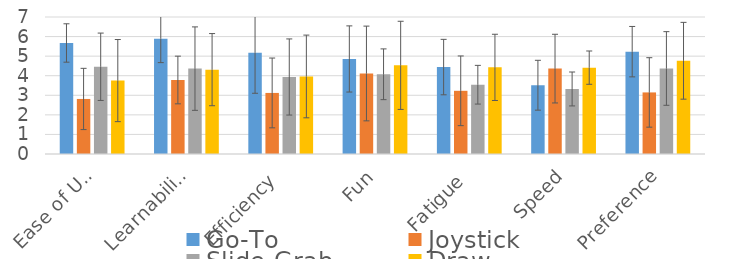
| Category | Go-To | Joystick | Slide-Grab | Draw |
|---|---|---|---|---|
| Ease of Use | 5.672 | 2.812 | 4.458 | 3.751 |
| Learnability | 5.895 | 3.781 | 4.362 | 4.31 |
| Efficiency | 5.176 | 3.12 | 3.935 | 3.962 |
| Fun | 4.856 | 4.114 | 4.074 | 4.53 |
| Fatigue | 4.441 | 3.229 | 3.54 | 4.426 |
| Speed | 3.514 | 4.362 | 3.322 | 4.412 |
| Preference | 5.229 | 3.146 | 4.37 | 4.764 |